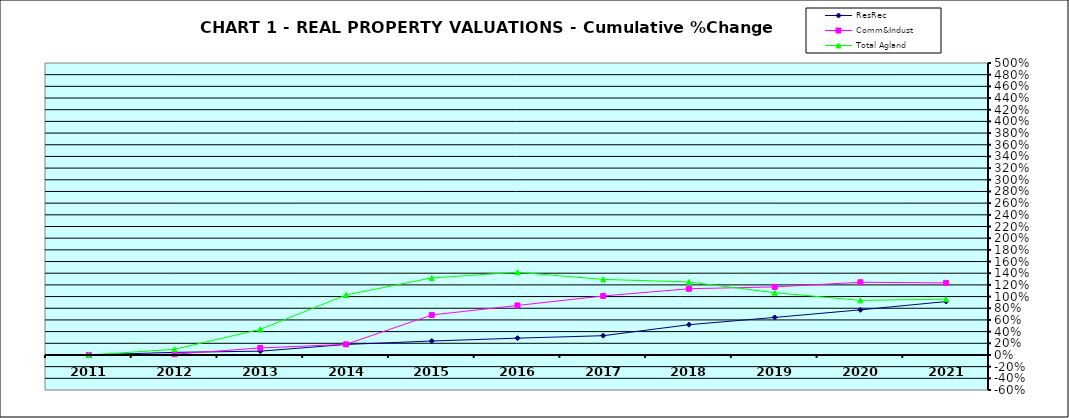
| Category | ResRec | Comm&Indust | Total Agland |
|---|---|---|---|
| 2011.0 | 0 | 0 | 0 |
| 2012.0 | 0.045 | 0.013 | 0.097 |
| 2013.0 | 0.065 | 0.12 | 0.439 |
| 2014.0 | 0.18 | 0.182 | 1.027 |
| 2015.0 | 0.239 | 0.685 | 1.32 |
| 2016.0 | 0.288 | 0.848 | 1.416 |
| 2017.0 | 0.33 | 1.01 | 1.294 |
| 2018.0 | 0.518 | 1.134 | 1.25 |
| 2019.0 | 0.643 | 1.166 | 1.067 |
| 2020.0 | 0.773 | 1.245 | 0.935 |
| 2021.0 | 0.915 | 1.234 | 0.956 |